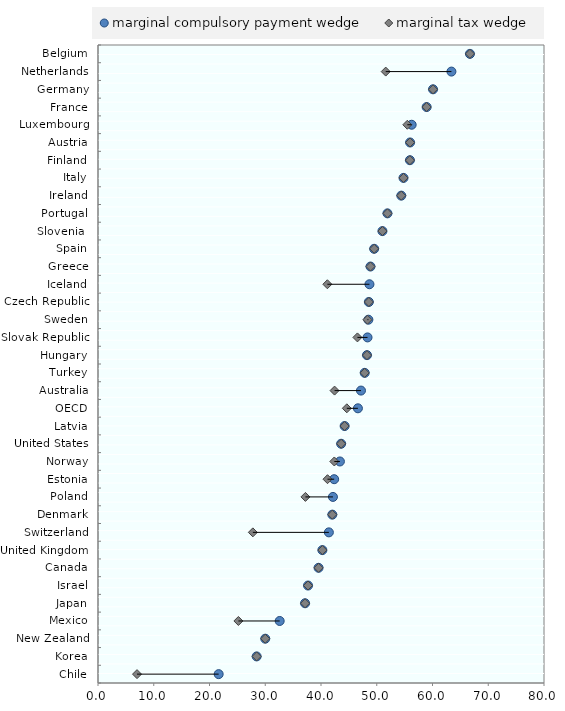
| Category | blankName |
|---|---|
| Chile | 7 |
| Korea | 28.46 |
| New Zealand | 30 |
| Mexico | 25.182 |
| Japan | 37.142 |
| Israel | 37.674 |
| Canada | 39.561 |
| United Kingdom | 40.246 |
| Switzerland | 27.775 |
| Denmark | 42.031 |
| Poland | 37.207 |
| Estonia | 41.166 |
| Norway | 42.389 |
| United States | 43.614 |
| Latvia | 44.239 |
| OECD | 44.632 |
| Australia | 42.435 |
| Turkey | 47.837 |
| Hungary | 48.249 |
| Slovak Republic | 46.535 |
| Sweden | 48.334 |
| Czech Republic | 48.582 |
| Iceland | 41.142 |
| Greece | 48.875 |
| Spain | 49.534 |
| Slovenia  | 51.019 |
| Portugal | 51.919 |
| Ireland | 54.402 |
| Italy | 54.8 |
| Finland | 55.949 |
| Austria | 55.978 |
| Luxembourg | 55.482 |
| France | 58.95 |
| Germany | 60.096 |
| Netherlands | 51.611 |
| Belgium | 66.717 |